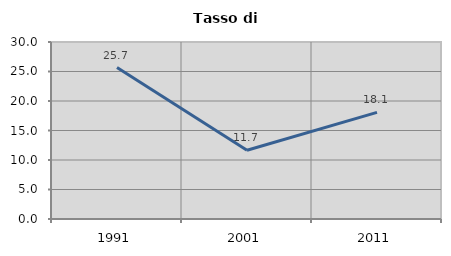
| Category | Tasso di disoccupazione   |
|---|---|
| 1991.0 | 25.668 |
| 2001.0 | 11.656 |
| 2011.0 | 18.079 |